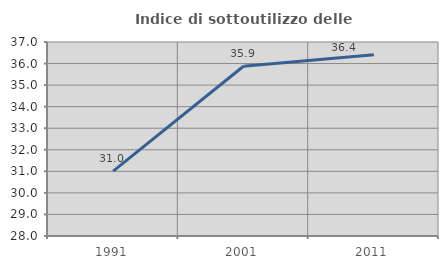
| Category | Indice di sottoutilizzo delle abitazioni  |
|---|---|
| 1991.0 | 31.006 |
| 2001.0 | 35.876 |
| 2011.0 | 36.41 |